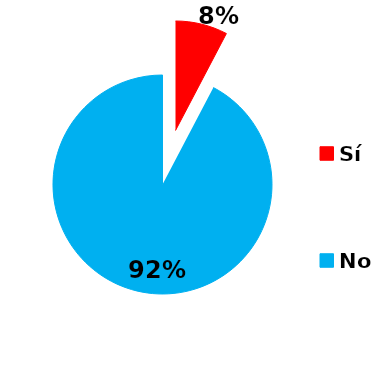
| Category | Series 0 |
|---|---|
| Sí | 3 |
| No | 36 |